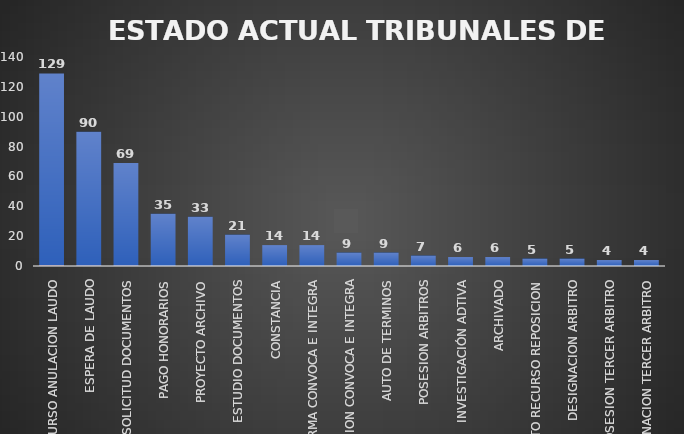
| Category | CANTIDAD | % |
|---|---|---|
| RECURSO ANULACION LAUDO | 129 | 0.277 |
| ESPERA DE LAUDO | 90 | 0.16 |
| SOLICITUD DOCUMENTOS | 69 | 0.145 |
| PAGO HONORARIOS | 35 | 0.068 |
| PROYECTO ARCHIVO | 33 | 0.079 |
| ESTUDIO DOCUMENTOS | 21 | 0.046 |
| CONSTANCIA | 14 | 0.033 |
| FIRMA CONVOCA E INTEGRA | 14 | 0.036 |
| REVISION CONVOCA E INTEGRA | 9 | 0.016 |
| AUTO DE TERMINOS | 9 | 0.02 |
| POSESION ARBITROS | 7 | 0.013 |
| INVESTIGACIÓN ADTIVA | 6 | 0.013 |
| ARCHIVADO | 6 | 0.012 |
| PROYECTO RECURSO REPOSICION | 5 | 0.009 |
| DESIGNACION ARBITRO | 5 | 0.016 |
| POSESION TERCER ARBITRO | 4 | 0.01 |
| DESIGNACION TERCER ARBITRO | 4 | 0.011 |